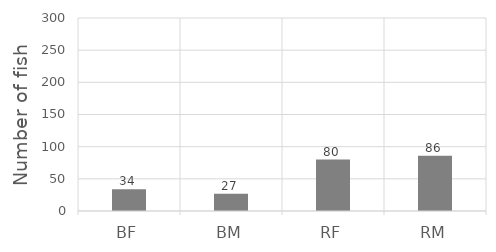
| Category | Series 0 |
|---|---|
| BF | 34 |
| BM | 27 |
| RF | 80 |
| RM | 86 |